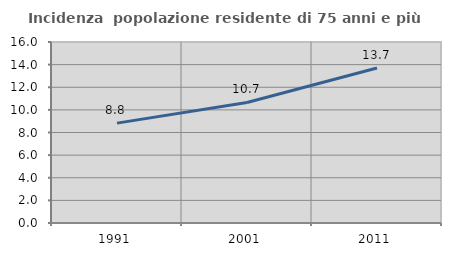
| Category | Incidenza  popolazione residente di 75 anni e più |
|---|---|
| 1991.0 | 8.828 |
| 2001.0 | 10.653 |
| 2011.0 | 13.702 |